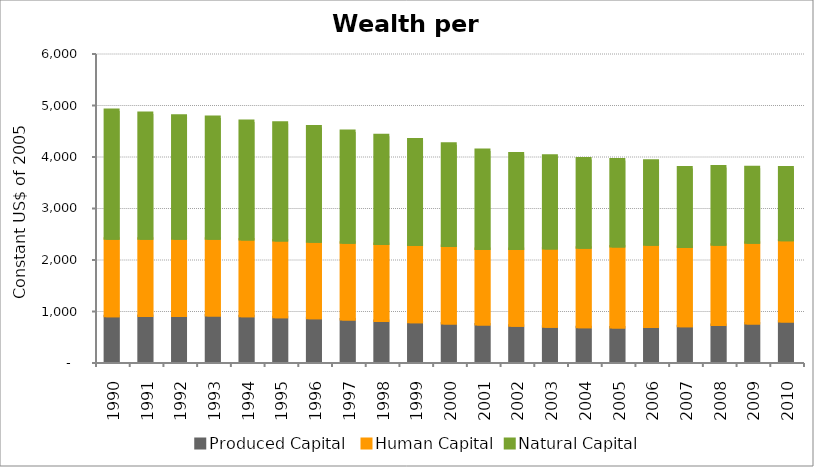
| Category | Produced Capital  | Human Capital | Natural Capital |
|---|---|---|---|
| 1990.0 | 889.469 | 1504.808 | 2499.421 |
| 1991.0 | 892.63 | 1500.836 | 2441.452 |
| 1992.0 | 893.962 | 1497.486 | 2390.571 |
| 1993.0 | 900.736 | 1494.873 | 2361.632 |
| 1994.0 | 886.488 | 1492.062 | 2302.836 |
| 1995.0 | 870.67 | 1487.573 | 2286.715 |
| 1996.0 | 847.294 | 1487.604 | 2239.096 |
| 1997.0 | 823.046 | 1490.592 | 2173.672 |
| 1998.0 | 794.545 | 1494.927 | 2115.114 |
| 1999.0 | 771.175 | 1499.413 | 2049.781 |
| 2000.0 | 749.125 | 1503.7 | 1982.665 |
| 2001.0 | 729.121 | 1465.042 | 1921.939 |
| 2002.0 | 704.892 | 1491.163 | 1852.421 |
| 2003.0 | 685.255 | 1518.012 | 1801.82 |
| 2004.0 | 672.644 | 1545.032 | 1735.314 |
| 2005.0 | 671.482 | 1571.45 | 1690.349 |
| 2006.0 | 680.133 | 1594.325 | 1635.721 |
| 2007.0 | 694.456 | 1540.968 | 1541.489 |
| 2008.0 | 719.384 | 1558.438 | 1517.606 |
| 2009.0 | 746.332 | 1567.426 | 1465.382 |
| 2010.0 | 788.593 | 1576.139 | 1413.744 |